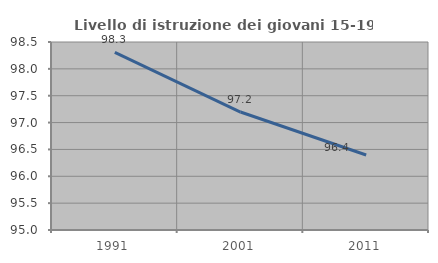
| Category | Livello di istruzione dei giovani 15-19 anni |
|---|---|
| 1991.0 | 98.305 |
| 2001.0 | 97.196 |
| 2011.0 | 96.396 |